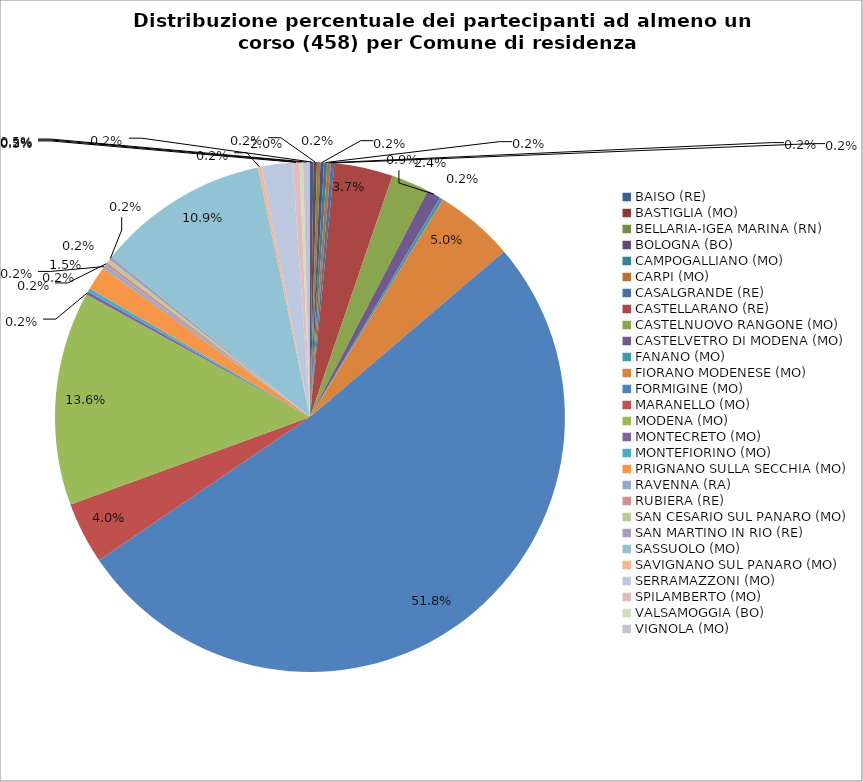
| Category | Nr. Tesserati |
|---|---|
| BAISO (RE) | 1 |
| BASTIGLIA (MO) | 1 |
| BELLARIA-IGEA MARINA (RN) | 1 |
| BOLOGNA (BO) | 1 |
| CAMPOGALLIANO (MO) | 1 |
| CARPI (MO) | 1 |
| CASALGRANDE (RE) | 1 |
| CASTELLARANO (RE) | 17 |
| CASTELNUOVO RANGONE (MO) | 11 |
| CASTELVETRO DI MODENA (MO) | 4 |
| FANANO (MO) | 1 |
| FIORANO MODENESE (MO) | 23 |
| FORMIGINE (MO) | 237 |
| MARANELLO (MO) | 18 |
| MODENA (MO) | 62 |
| MONTECRETO (MO) | 1 |
| MONTEFIORINO (MO) | 1 |
| PRIGNANO SULLA SECCHIA (MO) | 7 |
| RAVENNA (RA) | 1 |
| RUBIERA (RE) | 1 |
| SAN CESARIO SUL PANARO (MO) | 1 |
| SAN MARTINO IN RIO (RE) | 1 |
| SASSUOLO (MO) | 50 |
| SAVIGNANO SUL PANARO (MO) | 1 |
| SERRAMAZZONI (MO) | 9 |
| SPILAMBERTO (MO) | 2 |
| VALSAMOGGIA (BO) | 1 |
| VIGNOLA (MO) | 2 |